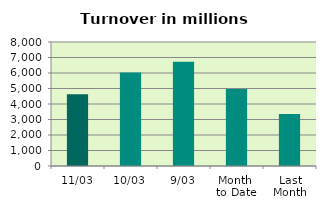
| Category | Series 0 |
|---|---|
| 11/03 | 4631.344 |
| 10/03 | 6027.811 |
| 9/03 | 6723.168 |
| Month 
to Date | 4974.72 |
| Last
Month | 3347.876 |